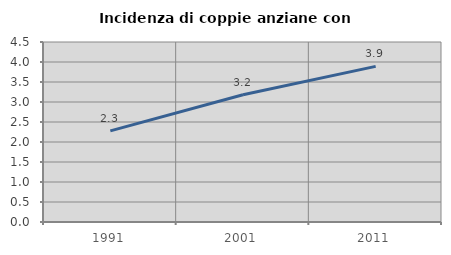
| Category | Incidenza di coppie anziane con figli |
|---|---|
| 1991.0 | 2.278 |
| 2001.0 | 3.181 |
| 2011.0 | 3.891 |